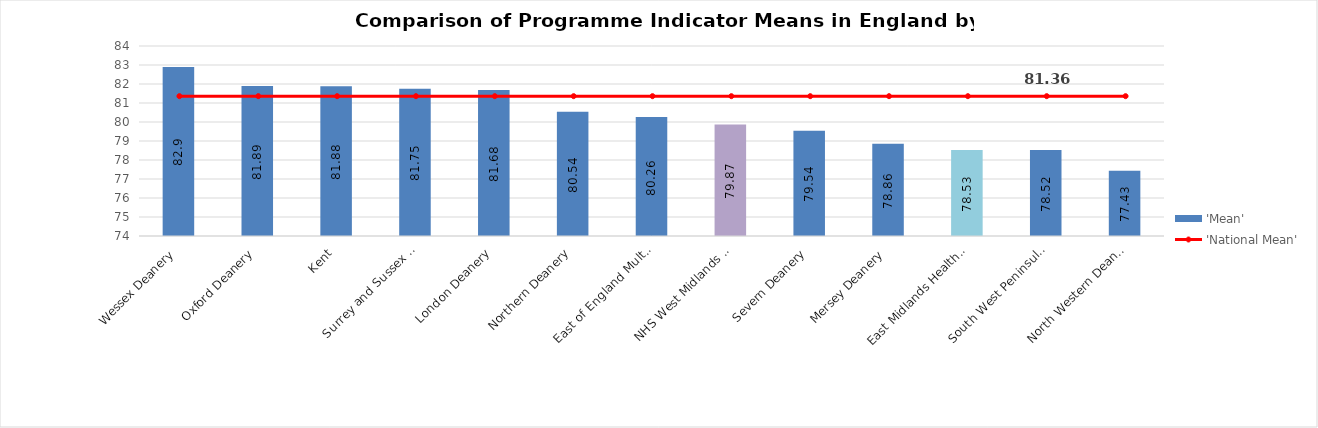
| Category | 'Mean' |
|---|---|
| Wessex Deanery | 82.9 |
| Oxford Deanery | 81.89 |
| Kent, Surrey and Sussex Deanery | 81.88 |
| London Deanery | 81.75 |
| Northern Deanery | 81.68 |
| East of England Multi-Professional Deanery | 80.54 |
| NHS West Midlands Workforce Deanery | 80.26 |
| Severn Deanery | 79.87 |
| Mersey Deanery | 79.54 |
| East Midlands Healthcare Workforce Deanery | 78.86 |
| South West Peninsula Deanery | 78.53 |
| North Western Deanery | 78.52 |
| Yorkshire and the Humber Postgraduate Deanery | 77.43 |